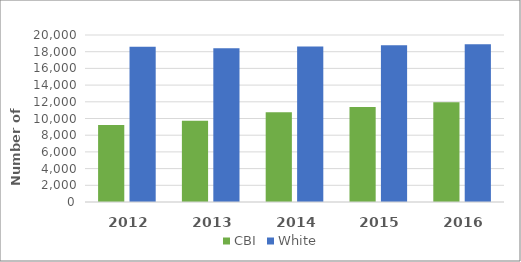
| Category | CBI | White |
|---|---|---|
| 2012.0 | 9221 | 18602 |
| 2013.0 | 9732 | 18424 |
| 2014.0 | 10757 | 18636 |
| 2015.0 | 11386 | 18764 |
| 2016.0 | 11947 | 18907 |